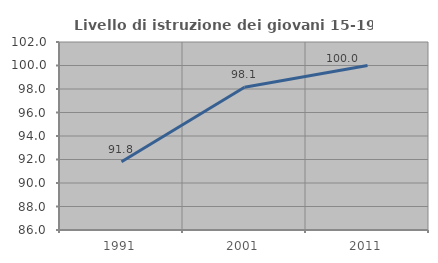
| Category | Livello di istruzione dei giovani 15-19 anni |
|---|---|
| 1991.0 | 91.803 |
| 2001.0 | 98.148 |
| 2011.0 | 100 |